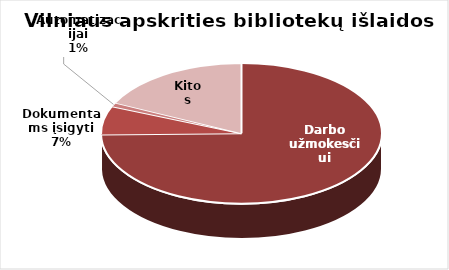
| Category | Series 0 |
|---|---|
| Darbo užmokesčiui | 6958456.09 |
| Dokumentams įsigyti | 610612.83 |
| Automatizacijai | 81630.76 |
| Kitos | 1657984.47 |